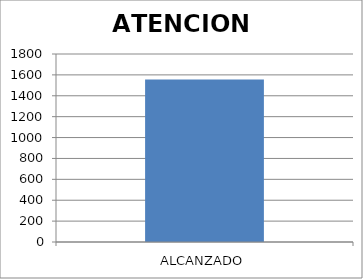
| Category | ATENCION BRINDADA |
|---|---|
| ALCANZADO | 1555 |